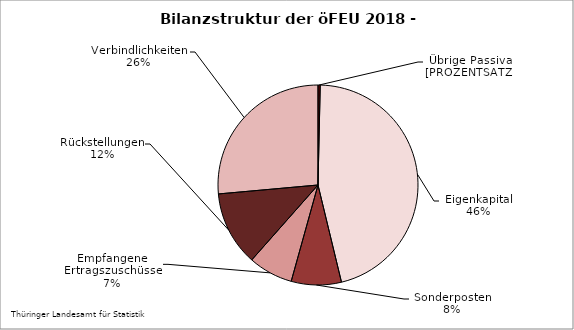
| Category | Series 0 |
|---|---|
| Übrige Passiva, Rechnungsab-grenzungsposten | 0.356 |
| Eigenkapital | 45.869 |
| SoPo mit Rücklageanteil, aus Zuwendungen und anderweitig nicht genannt | 8.093 |
| Empfangene Ertragszuschüsse | 7.201 |
| Rückstellungen | 12.052 |
| Verbindlichkeiten | 26.429 |